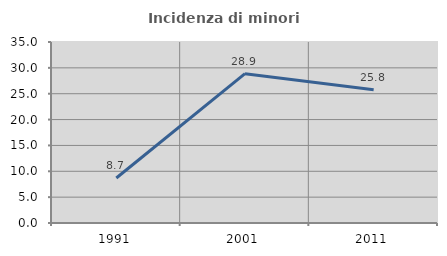
| Category | Incidenza di minori stranieri |
|---|---|
| 1991.0 | 8.696 |
| 2001.0 | 28.881 |
| 2011.0 | 25.775 |